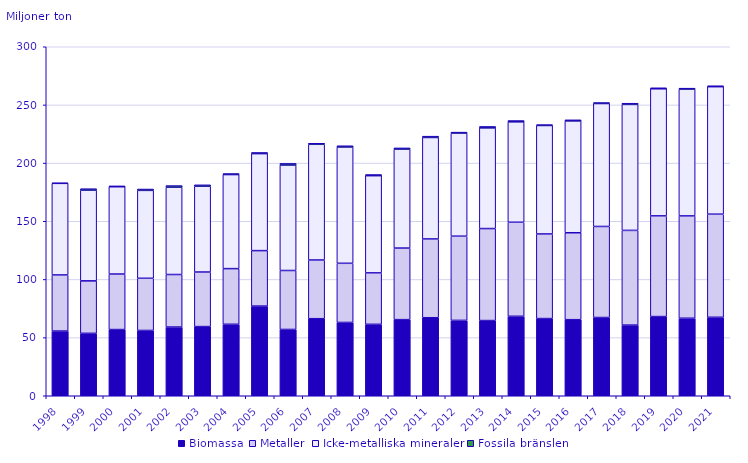
| Category | Biomassa | Metaller | Icke-metalliska mineraler | Fossila bränslen |
|---|---|---|---|---|
| 1998.0 | 55.605 | 48.234 | 78.756 | 0.319 |
| 1999.0 | 53.658 | 45.113 | 77.989 | 1.234 |
| 2000.0 | 56.896 | 47.732 | 75.055 | 0.712 |
| 2001.0 | 56.119 | 44.862 | 75.561 | 1.169 |
| 2002.0 | 59.06 | 45.156 | 75.047 | 1.406 |
| 2003.0 | 59.467 | 46.889 | 73.732 | 1.243 |
| 2004.0 | 61.447 | 47.83 | 80.845 | 0.894 |
| 2005.0 | 77.071 | 47.687 | 83.378 | 1 |
| 2006.0 | 56.983 | 50.691 | 90.646 | 1.427 |
| 2007.0 | 66.233 | 50.466 | 99.471 | 0.878 |
| 2008.0 | 63.018 | 50.844 | 99.977 | 1.071 |
| 2009.0 | 61.401 | 44.222 | 83.551 | 1.002 |
| 2010.0 | 65.425 | 61.516 | 85.067 | 1.039 |
| 2011.0 | 67.071 | 67.717 | 87.229 | 1.125 |
| 2012.0 | 64.791 | 72.374 | 88.61 | 0.847 |
| 2013.0 | 64.639 | 79.086 | 86.528 | 1.255 |
| 2014.0 | 68.306 | 80.836 | 86.326 | 1.112 |
| 2015.0 | 66.337 | 72.734 | 93.26 | 0.718 |
| 2016.0 | 65.39 | 74.733 | 96.14 | 0.925 |
| 2017.0 | 67.262 | 78.264 | 105.678 | 0.825 |
| 2018.0 | 60.73 | 81.424 | 108.271 | 1.04 |
| 2019.0 | 68.061 | 86.554 | 109.262 | 0.863 |
| 2020.0 | 66.642 | 87.949 | 109.023 | 0.787 |
| 2021.0 | 67.455 | 88.616 | 109.611 | 0.789 |